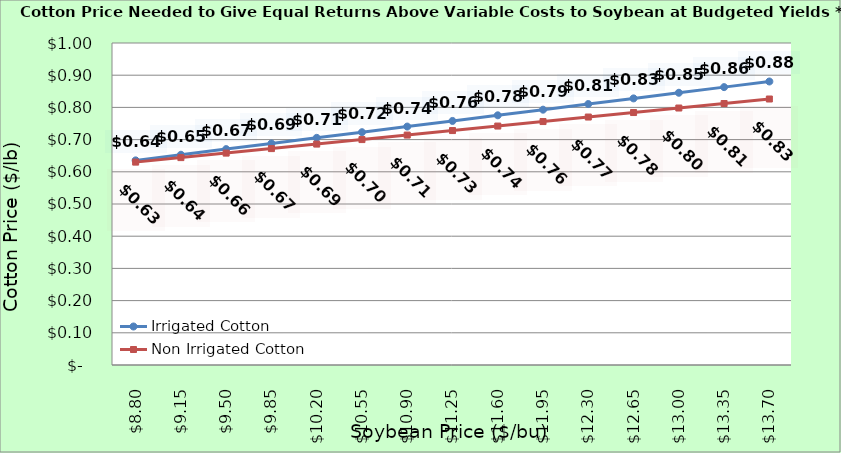
| Category | Irrigated Cotton | Non Irrigated Cotton |
|---|---|---|
| 8.800000000000002 | 0.635 | 0.63 |
| 9.150000000000002 | 0.653 | 0.644 |
| 9.500000000000002 | 0.67 | 0.658 |
| 9.850000000000001 | 0.688 | 0.672 |
| 10.200000000000001 | 0.705 | 0.686 |
| 10.55 | 0.723 | 0.7 |
| 10.9 | 0.74 | 0.714 |
| 11.25 | 0.758 | 0.728 |
| 11.6 | 0.775 | 0.742 |
| 11.95 | 0.793 | 0.756 |
| 12.299999999999999 | 0.81 | 0.77 |
| 12.649999999999999 | 0.828 | 0.784 |
| 12.999999999999998 | 0.845 | 0.798 |
| 13.349999999999998 | 0.863 | 0.812 |
| 13.699999999999998 | 0.88 | 0.826 |